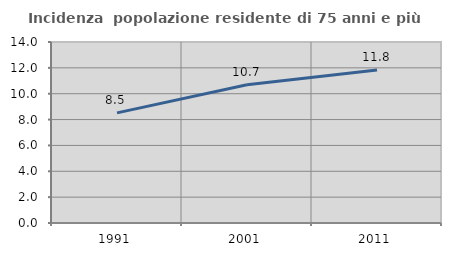
| Category | Incidenza  popolazione residente di 75 anni e più |
|---|---|
| 1991.0 | 8.52 |
| 2001.0 | 10.69 |
| 2011.0 | 11.833 |